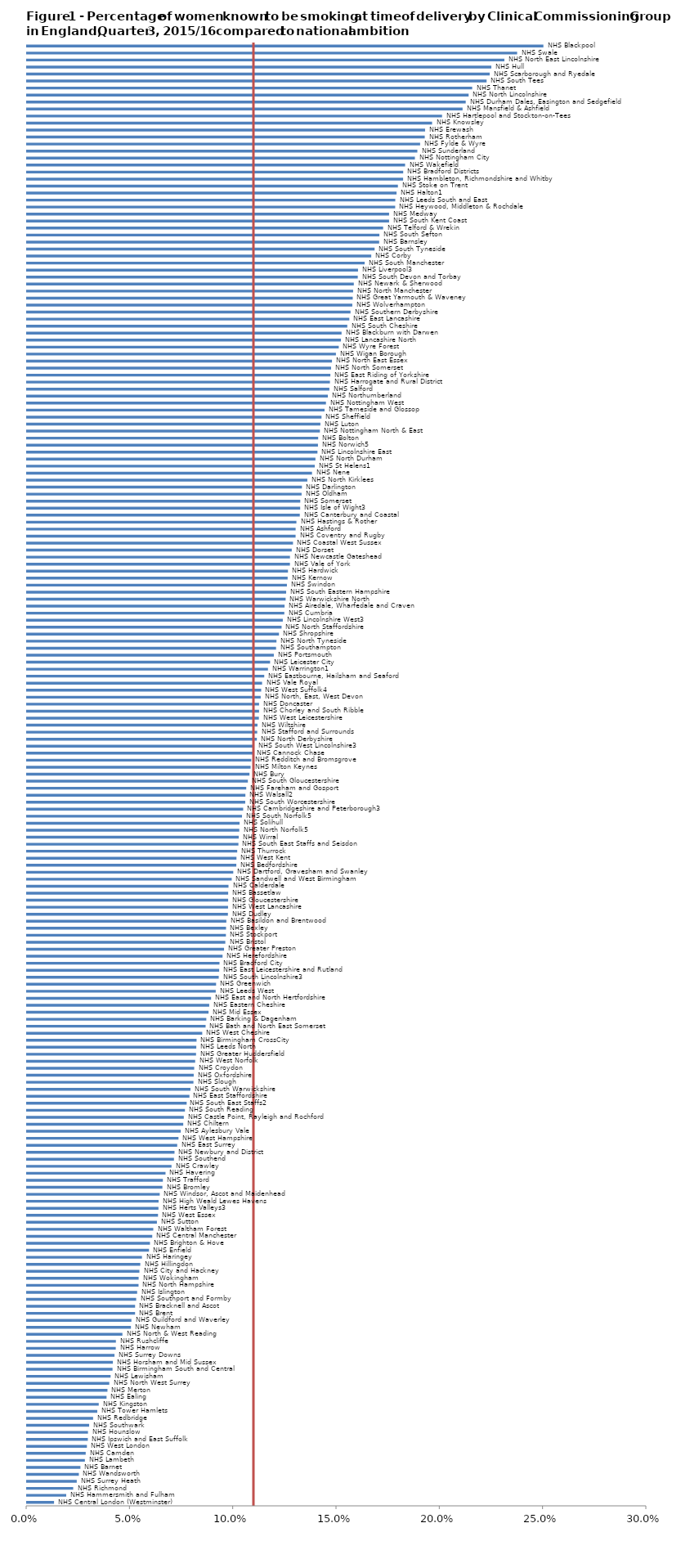
| Category | Series 0 |
|---|---|
| NHS Central London (Westminster)  | 0.013 |
| NHS Hammersmith and Fulham  | 0.019 |
| NHS Richmond  | 0.022 |
| NHS Surrey Heath  | 0.024 |
| NHS Wandsworth  | 0.025 |
| NHS Barnet  | 0.026 |
| NHS Lambeth  | 0.028 |
| NHS Camden  | 0.028 |
| NHS West London | 0.029 |
| NHS Ipswich and East Suffolk  | 0.029 |
| NHS Hounslow  | 0.03 |
| NHS Southwark  | 0.03 |
| NHS Redbridge  | 0.032 |
| NHS Tower Hamlets  | 0.034 |
| NHS Kingston  | 0.035 |
| NHS Ealing  | 0.039 |
| NHS Merton  | 0.039 |
| NHS North West Surrey  | 0.04 |
| NHS Lewisham  | 0.04 |
| NHS Birmingham South and Central  | 0.041 |
| NHS Horsham and Mid Sussex  | 0.042 |
| NHS Surrey Downs  | 0.042 |
| NHS Harrow  | 0.043 |
| NHS Rushcliffe  | 0.043 |
| NHS North & West Reading  | 0.046 |
| NHS Newham  | 0.05 |
| NHS Guildford and Waverley | 0.051 |
| NHS Brent  | 0.052 |
| NHS Bracknell and Ascot  | 0.052 |
| NHS Southport and Formby  | 0.053 |
| NHS Islington  | 0.053 |
| NHS North Hampshire  | 0.054 |
| NHS Wokingham  | 0.054 |
| NHS City and Hackney  | 0.054 |
| NHS Hillingdon  | 0.055 |
| NHS Haringey  | 0.056 |
| NHS Enfield  | 0.059 |
| NHS Brighton & Hove  | 0.06 |
| NHS Central Manchester  | 0.061 |
| NHS Waltham Forest | 0.061 |
| NHS Sutton  | 0.063 |
| NHS West Essex  | 0.063 |
| NHS Herts Valleys3  | 0.064 |
| NHS High Weald Lewes Havens  | 0.064 |
| NHS Windsor, Ascot and Maidenhead  | 0.064 |
| NHS Bromley  | 0.066 |
| NHS Trafford  | 0.066 |
| NHS Havering  | 0.067 |
| NHS Crawley  | 0.07 |
| NHS Southend  | 0.071 |
| NHS Newbury and District  | 0.071 |
| NHS East Surrey  | 0.073 |
| NHS West Hampshire  | 0.073 |
| NHS Aylesbury Vale  | 0.074 |
| NHS Chiltern  | 0.076 |
| NHS Castle Point, Rayleigh and Rochford  | 0.076 |
| NHS South Reading  | 0.076 |
| NHS North East Hampshire and Farnham  | 0.077 |
| NHS East Staffordshire  | 0.079 |
| NHS South Warwickshire  | 0.079 |
| NHS Slough  | 0.081 |
| NHS Oxfordshire  | 0.081 |
| NHS Croydon  | 0.081 |
| NHS West Norfolk  | 0.081 |
| NHS Greater Huddersfield  | 0.082 |
| NHS Leeds North  | 0.082 |
| NHS Birmingham CrossCity  | 0.082 |
| NHS West Cheshire  | 0.085 |
| NHS Bath and North East Somerset  | 0.086 |
| NHS Barking & Dagenham  | 0.087 |
| NHS Mid Essex  | 0.088 |
| NHS Eastern Cheshire  | 0.088 |
| NHS East and North Hertfordshire  | 0.089 |
| NHS Leeds West  | 0.091 |
| NHS Greenwich  | 0.092 |
| NHS South Lincolnshire3  | 0.093 |
| NHS East Leicestershire and Rutland  | 0.093 |
| NHS Bradford City  | 0.093 |
| NHS Herefordshire | 0.095 |
| NHS Greater Preston  | 0.095 |
| NHS Bristol  | 0.096 |
| NHS Stockport  | 0.096 |
| NHS Bexley  | 0.096 |
| NHS Basildon and Brentwood  | 0.097 |
| NHS Dudley  | 0.097 |
| NHS West Lancashire  | 0.097 |
| NHS Gloucestershire  | 0.097 |
| NHS Bassetlaw  | 0.097 |
| NHS Calderdale  | 0.098 |
| NHS Sandwell and West Birmingham  | 0.099 |
| NHS Dartford, Gravesham and Swanley  | 0.1 |
| NHS Bedfordshire  | 0.101 |
| NHS West Kent  | 0.101 |
| NHS Thurrock  | 0.102 |
| NHS South East Staffs and Seisdon and Peninsular  | 0.102 |
| NHS Wirral | 0.103 |
| NHS North Norfolk5  | 0.103 |
| NHS Solihull  | 0.103 |
| NHS South Norfolk5  | 0.104 |
| NHS Cambridgeshire and Peterborough3 | 0.105 |
| NHS South Worcestershire  | 0.106 |
| NHS Walsall2  | 0.106 |
| NHS Fareham and Gosport  | 0.106 |
| NHS South Gloucestershire  | 0.107 |
| NHS Bury  | 0.108 |
| NHS Milton Keynes  | 0.108 |
| NHS Redditch and Bromsgrove  | 0.109 |
| NHS Cannock Chase | 0.109 |
| NHS South West Lincolnshire3 | 0.11 |
| NHS North Derbyshire  | 0.111 |
| NHS Stafford and Surrounds | 0.111 |
| NHS Wiltshire  | 0.112 |
| NHS West Leicestershire  | 0.112 |
| NHS Chorley and South Ribble  | 0.112 |
| NHS Doncaster  | 0.112 |
| NHS North, East, West Devon  | 0.113 |
| NHS West Suffolk4  | 0.113 |
| NHS Vale Royal  | 0.114 |
| NHS Eastbourne, Hailsham and Seaford  | 0.115 |
| NHS Warrington1  | 0.117 |
| NHS Leicester City  | 0.118 |
| NHS Portsmouth  | 0.12 |
| NHS Southampton  | 0.121 |
| NHS North Tyneside  | 0.121 |
| NHS Shropshire  | 0.122 |
| NHS North Staffordshire  | 0.123 |
| NHS Lincolnshire West3  | 0.124 |
| NHS Cumbria  | 0.125 |
| NHS Airedale, Wharfedale and Craven  | 0.125 |
| NHS Warwickshire North  | 0.125 |
| NHS South Eastern Hampshire  | 0.125 |
| NHS Swindon  | 0.126 |
| NHS Kernow  | 0.126 |
| NHS Hardwick  | 0.126 |
| NHS Vale of York  | 0.127 |
| NHS Newcastle Gateshead | 0.127 |
| NHS Dorset  | 0.128 |
| NHS Coastal West Sussex  | 0.129 |
| NHS Coventry and Rugby  | 0.13 |
| NHS Ashford  | 0.13 |
| NHS Hastings & Rother  | 0.13 |
| NHS Canterbury and Coastal  | 0.132 |
| NHS Isle of Wight3  | 0.132 |
| NHS Somerset  | 0.132 |
| NHS Oldham  | 0.133 |
| NHS Darlington  | 0.133 |
| NHS North Kirklees  | 0.136 |
| NHS Nene  | 0.138 |
| NHS St Helens1  | 0.139 |
| NHS North Durham  | 0.14 |
| NHS Lincolnshire East | 0.141 |
| NHS Norwich5  | 0.141 |
| NHS Bolton  | 0.141 |
| NHS Nottingham North & East  | 0.142 |
| NHS Luton  | 0.142 |
| NHS Sheffield  | 0.143 |
| NHS Tameside and Glossop  | 0.144 |
| NHS Nottingham West  | 0.145 |
| NHS Northumberland  | 0.146 |
| NHS Salford  | 0.146 |
| NHS Harrogate and Rural District  | 0.147 |
| NHS East Riding of Yorkshire  | 0.147 |
| NHS North Somerset  | 0.147 |
| NHS North East Essex  | 0.148 |
| NHS Wigan Borough  | 0.15 |
| NHS Wyre Forest  | 0.151 |
| NHS Lancashire North  | 0.152 |
| NHS Blackburn with Darwen  | 0.152 |
| NHS South Cheshire  | 0.155 |
| NHS East Lancashire  | 0.156 |
| NHS Southern Derbyshire  | 0.157 |
| NHS Wolverhampton  | 0.158 |
| NHS Great Yarmouth & Waveney  | 0.158 |
| NHS North Manchester  | 0.158 |
| NHS Newark & Sherwood  | 0.158 |
| NHS South Devon and Torbay  | 0.16 |
| NHS Liverpool3  | 0.16 |
| NHS South Manchester  | 0.163 |
| NHS Corby  | 0.167 |
| NHS South Tyneside  | 0.168 |
| NHS Barnsley  | 0.171 |
| NHS South Sefton  | 0.171 |
| NHS Telford & Wrekin  | 0.172 |
| NHS South Kent Coast  | 0.175 |
| NHS Medway  | 0.175 |
| NHS Heywood, Middleton & Rochdale  | 0.178 |
| NHS Leeds South and East  | 0.178 |
| NHS Halton1 | 0.179 |
| NHS Stoke on Trent  | 0.18 |
| NHS Hambleton, Richmondshire and Whitby  | 0.182 |
| NHS Bradford Districts  | 0.182 |
| NHS Wakefield  | 0.183 |
| NHS Nottingham City  | 0.188 |
| NHS Sunderland  | 0.189 |
| NHS Fylde & Wyre  | 0.19 |
| NHS Rotherham  | 0.193 |
| NHS Erewash  | 0.193 |
| NHS Knowsley  | 0.196 |
| NHS Hartlepool and Stockton-on-Tees  | 0.201 |
| NHS Mansfield & Ashfield  | 0.211 |
| NHS Durham Dales, Easington and Sedgefield  | 0.212 |
| NHS North Lincolnshire  | 0.214 |
| NHS Thanet  | 0.216 |
| NHS South Tees  | 0.223 |
| NHS Scarborough and Ryedale  | 0.224 |
| NHS Hull  | 0.225 |
| NHS North East Lincolnshire  | 0.231 |
| NHS Swale  | 0.237 |
| NHS Blackpool  | 0.25 |